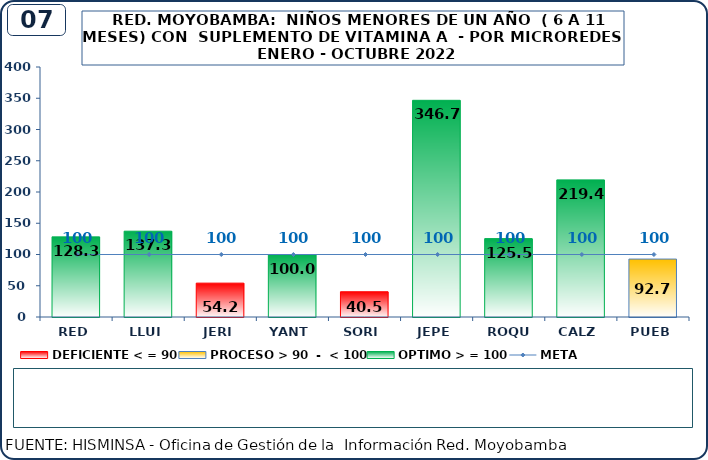
| Category | DEFICIENTE < = 90 | PROCESO > 90  -  < 100 | OPTIMO > = 100 |
|---|---|---|---|
| RED | 0 | 0 | 128.3 |
| LLUI | 0 | 0 | 137.3 |
| JERI | 54.2 | 0 | 0 |
| YANT | 0 | 0 | 100 |
| SORI | 40.5 | 0 | 0 |
| JEPE | 0 | 0 | 346.7 |
| ROQU | 0 | 0 | 125.5 |
| CALZ | 0 | 0 | 219.4 |
| PUEB | 0 | 92.7 | 0 |